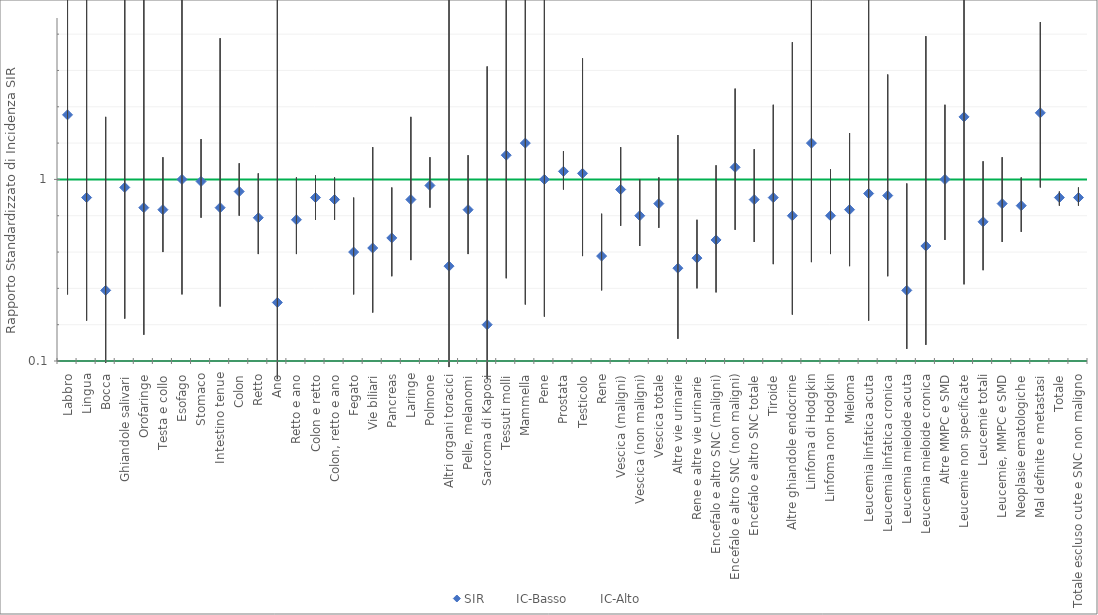
| Category | SIR | IC-Basso | IC-Alto |
|---|---|---|---|
| Labbro | 1.32 | 0.43 | 3.07 |
| Lingua | 0.91 | 0.3 | 2.13 |
| Bocca | 0.45 | 0.09 | 1.31 |
| Ghiandole salivari | 0.96 | 0.31 | 2.25 |
| Orofaringe | 0.86 | 0.23 | 2.2 |
| Testa e collo | 0.85 | 0.64 | 1.11 |
| Esofago | 1 | 0.43 | 1.97 |
| Stomaco | 0.99 | 0.81 | 1.2 |
| Intestino tenue | 0.86 | 0.37 | 1.7 |
| Colon | 0.94 | 0.82 | 1.08 |
| Retto | 0.81 | 0.63 | 1.03 |
| Ano | 0.39 | 0.01 | 2.18 |
| Retto e ano | 0.8 | 0.63 | 1.01 |
| Colon e retto | 0.91 | 0.8 | 1.02 |
| Colon, retto e ano | 0.9 | 0.8 | 1.01 |
| Fegato | 0.64 | 0.43 | 0.91 |
| Vie biliari | 0.66 | 0.34 | 1.16 |
| Pancreas | 0.71 | 0.52 | 0.96 |
| Laringe | 0.9 | 0.6 | 1.31 |
| Polmone | 0.97 | 0.86 | 1.11 |
| Altri organi toracici | 0.57 | 0.07 | 2.06 |
| Pelle, melanomi | 0.85 | 0.63 | 1.12 |
| Sarcoma di Kaposi | 0.28 | 0.01 | 1.56 |
| Tessuti molli | 1.12 | 0.51 | 2.12 |
| Mammella | 1.18 | 0.38 | 2.75 |
| Pene | 1 | 0.32 | 2.33 |
| Prostata | 1.04 | 0.95 | 1.14 |
| Testicolo | 1.03 | 0.62 | 1.6 |
| Rene | 0.62 | 0.45 | 0.83 |
| Vescica (maligni) | 0.95 | 0.77 | 1.16 |
| Vescica (non maligni) | 0.82 | 0.67 | 1 |
| Vescica totale | 0.88 | 0.76 | 1.01 |
| Altre vie urinarie | 0.56 | 0.21 | 1.22 |
| Rene e altre vie urinarie | 0.61 | 0.46 | 0.8 |
| Encefalo e altro SNC (maligni) | 0.7 | 0.44 | 1.07 |
| Encefalo e altro SNC (non maligni) | 1.06 | 0.75 | 1.45 |
| Encefalo e altro SNC totale | 0.9 | 0.69 | 1.15 |
| Tiroide | 0.91 | 0.58 | 1.37 |
| Altre ghiandole endocrine | 0.82 | 0.33 | 1.68 |
| Linfoma di Hodgkin | 1.18 | 0.59 | 2.12 |
| Linfoma non Hodgkin | 0.82 | 0.63 | 1.05 |
| Mieloma | 0.85 | 0.57 | 1.23 |
| Leucemia linfatica acuta | 0.93 | 0.3 | 2.16 |
| Leucemia linfatica cronica | 0.92 | 0.52 | 1.52 |
| Leucemia mieloide acuta | 0.45 | 0.16 | 0.98 |
| Leucemia mieloide cronica | 0.67 | 0.18 | 1.71 |
| Altre MMPC e SMD | 1 | 0.7 | 1.37 |
| Leucemie non specificate | 1.31 | 0.48 | 2.85 |
| Leucemie totali | 0.79 | 0.55 | 1.09 |
| Leucemie, MMPC e SMD | 0.88 | 0.69 | 1.11 |
| Neoplasie ematologiche | 0.87 | 0.74 | 1.01 |
| Mal definite e metastasi | 1.33 | 0.96 | 1.78 |
| Totale | 0.91 | 0.87 | 0.94 |
| Totale escluso cute e SNC non maligno | 0.91 | 0.87 | 0.96 |